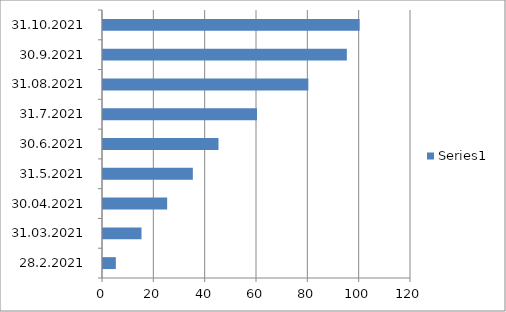
| Category | Series 0 |
|---|---|
| 28.2.2021 | 5 |
| 31.03.2021 | 15 |
| 30.04.2021 | 25 |
| 31.5.2021 | 35 |
| 30.6.2021 | 45 |
| 31.7.2021 | 60 |
| 31.08.2021 | 80 |
| 30.9.2021 | 95 |
| 31.10.2021 | 100 |